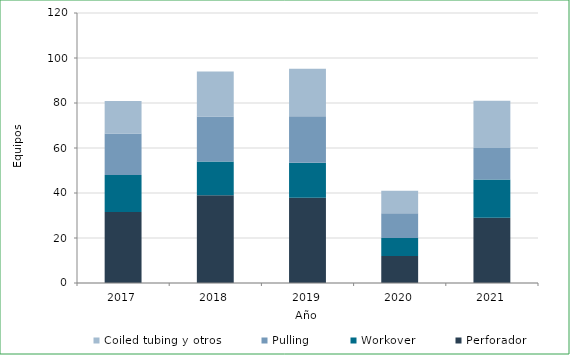
| Category | Perforador  | Workover | Pulling | Coiled tubing y otros  |
|---|---|---|---|---|
| 2017.0 | 31.583 | 16.417 | 18.417 | 14.5 |
| 2018.0 | 39 | 15 | 20 | 20 |
| 2019.0 | 37.917 | 15.5 | 20.667 | 21.167 |
| 2020.0 | 12 | 8 | 11 | 10 |
| 2021.0 | 29 | 17 | 14 | 21 |